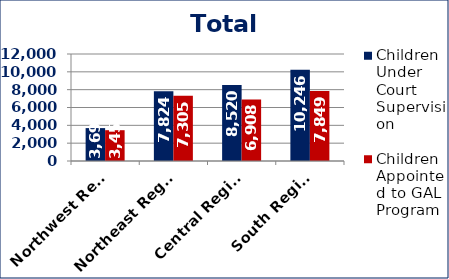
| Category | Children Under Court Supervision  | Children Appointed to GAL Program  |
|---|---|---|
| Northwest Region | 3690 | 3454 |
| Northeast Region | 7824 | 7305 |
| Central Region | 8520 | 6908 |
| South Region | 10246 | 7849 |